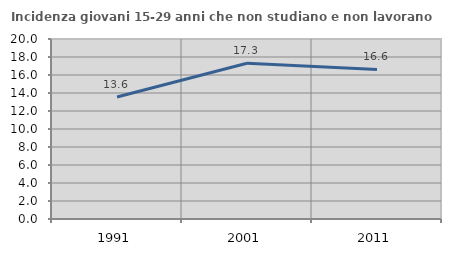
| Category | Incidenza giovani 15-29 anni che non studiano e non lavorano  |
|---|---|
| 1991.0 | 13.559 |
| 2001.0 | 17.306 |
| 2011.0 | 16.62 |